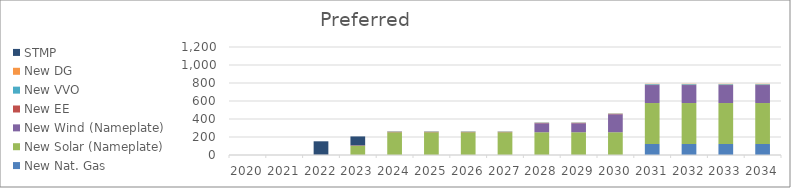
| Category | New Nat. Gas | New Solar (Nameplate) | New Wind (Nameplate) | New EE | New VVO | New DG | STMP |
|---|---|---|---|---|---|---|---|
| 2020.0 | 0 | 0 | 0 | 0 | 0 | 0 | 0 |
| 2021.0 | 0 | 0 | 0 | 0 | 0 | 0 | 0 |
| 2022.0 | 0 | 0 | 0 | 2.244 | 0 | 0 | 150 |
| 2023.0 | 0 | 101.198 | 0 | 4.147 | 0 | 1.022 | 100 |
| 2024.0 | 0 | 252.994 | 0 | 5.767 | 4.27 | 1.533 | 0 |
| 2025.0 | 0 | 252.994 | 0 | 5.323 | 4.27 | 1.533 | 0 |
| 2026.0 | 0 | 252.994 | 0 | 4.82 | 4.27 | 1.533 | 0 |
| 2027.0 | 0 | 252.994 | 0 | 4.304 | 4.27 | 2.044 | 0 |
| 2028.0 | 0 | 252.994 | 100 | 3.731 | 4.27 | 2.044 | 0 |
| 2029.0 | 0 | 252.994 | 100 | 3.043 | 4.27 | 2.555 | 0 |
| 2030.0 | 0 | 252.994 | 200 | 3.177 | 4.27 | 3.066 | 0 |
| 2031.0 | 122 | 455.389 | 200 | 2.968 | 7.554 | 3.577 | 0 |
| 2032.0 | 122 | 455.389 | 200 | 2.728 | 7.554 | 3.577 | 0 |
| 2033.0 | 122 | 455.389 | 200 | 2.109 | 7.554 | 4.088 | 0 |
| 2034.0 | 122 | 455.389 | 200 | 1.799 | 7.554 | 4.599 | 0 |